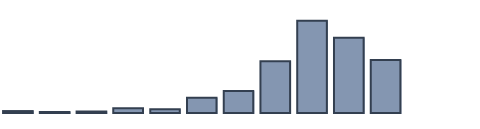
| Category | Series 0 |
|---|---|
| 0 | 0.6 |
| 1 | 0.3 |
| 2 | 0.5 |
| 3 | 1.5 |
| 4 | 1.2 |
| 5 | 4.7 |
| 6 | 6.8 |
| 7 | 16 |
| 8 | 28.6 |
| 9 | 23.3 |
| 10 | 16.4 |
| 11 | 0 |
| 12 | 0 |